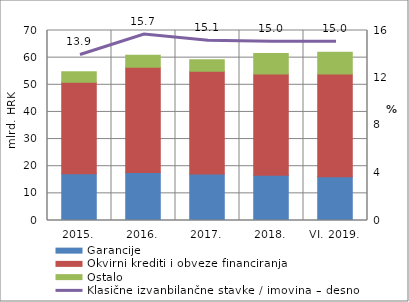
| Category | Garancije | Okvirni krediti i obveze financiranja | Ostalo |
|---|---|---|---|
| 2015. | 17.228 | 33.691 | 3.91 |
| 2016. | 17.713 | 38.773 | 4.381 |
| 2017. | 17.105 | 37.875 | 4.278 |
| 2018. | 16.691 | 37.267 | 7.544 |
| VI. 2019. | 16.125 | 37.861 | 7.997 |